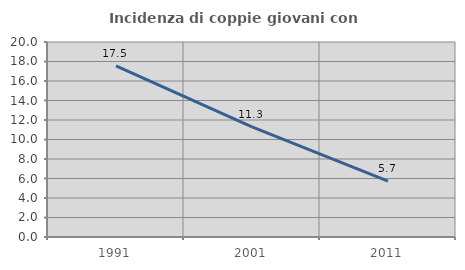
| Category | Incidenza di coppie giovani con figli |
|---|---|
| 1991.0 | 17.541 |
| 2001.0 | 11.295 |
| 2011.0 | 5.725 |